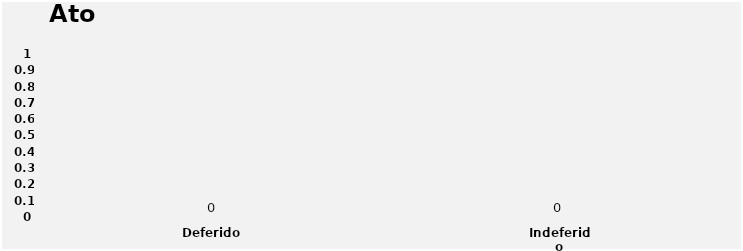
| Category | Series 0 |
|---|---|
| Deferido | 0 |
| Indeferido | 0 |